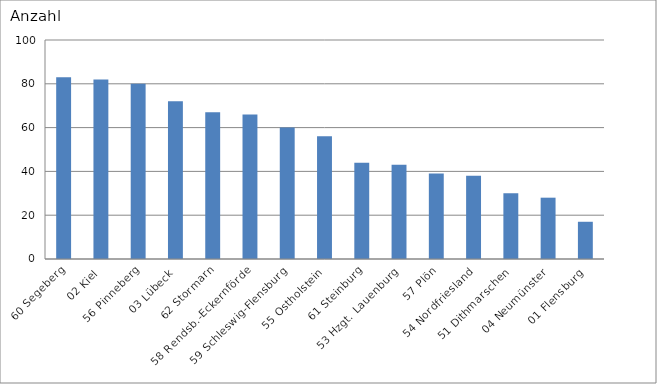
| Category | 60 Segeberg 02 Kiel 56 Pinneberg 03 Lübeck 62 Stormarn 58 Rendsb.-Eckernförde 59 Schleswig-Flensburg 55 Ostholstein 61 Steinburg 53 Hzgt. Lauenburg 57 Plön 54 Nordfriesland 51 Dithmarschen 04 Neumünster 01 Flensburg |
|---|---|
| 60 Segeberg | 83 |
| 02 Kiel | 82 |
| 56 Pinneberg | 80 |
| 03 Lübeck | 72 |
| 62 Stormarn | 67 |
| 58 Rendsb.-Eckernförde | 66 |
| 59 Schleswig-Flensburg | 60 |
| 55 Ostholstein | 56 |
| 61 Steinburg | 44 |
| 53 Hzgt. Lauenburg | 43 |
| 57 Plön | 39 |
| 54 Nordfriesland | 38 |
| 51 Dithmarschen | 30 |
| 04 Neumünster | 28 |
| 01 Flensburg | 17 |